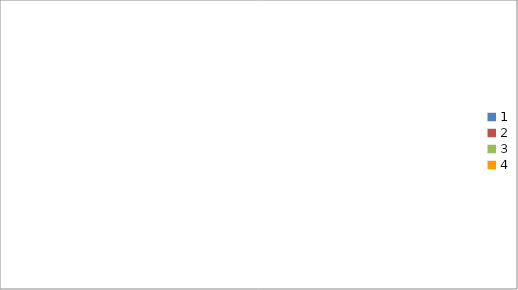
| Category | Series 0 |
|---|---|
| 0 | 1830 |
| 1 | 2620 |
| 2 | 2130 |
| 3 | 600 |